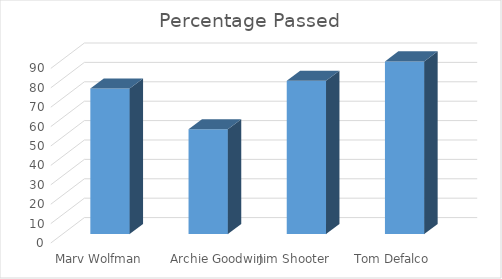
| Category | Percentage Passed |
|---|---|
| Marv Wolfman | 75 |
| Archie Goodwin | 54 |
| Jim Shooter | 79 |
| Tom Defalco | 89 |